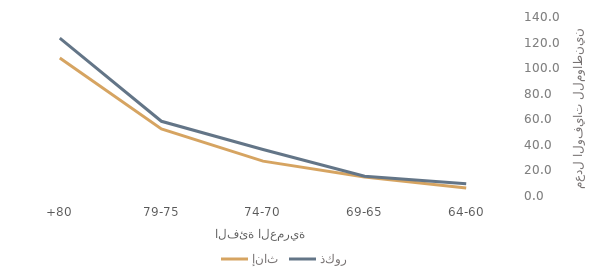
| Category | إناث | ذكور |
|---|---|---|
| 64-60 | 6.307 | 9.49 |
| 69-65 | 14.925 | 15.522 |
| 74-70 | 27.263 | 36.342 |
| 79-75 | 52.402 | 58.442 |
| +80 | 107.865 | 123.408 |